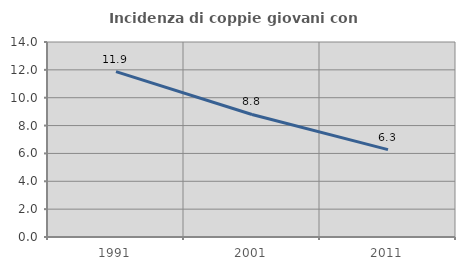
| Category | Incidenza di coppie giovani con figli |
|---|---|
| 1991.0 | 11.871 |
| 2001.0 | 8.795 |
| 2011.0 | 6.273 |